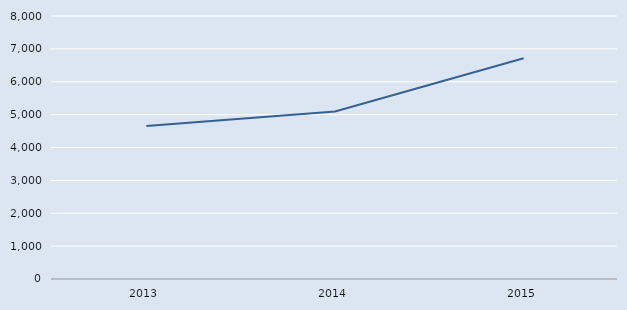
| Category | Series 0 |
|---|---|
| 2013.0 | 4651 |
| 2014.0 | 5098 |
| 2015.0 | 6715 |